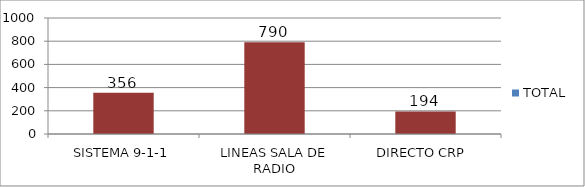
| Category | TOTAL |
|---|---|
| SISTEMA 9-1-1 | 356 |
| LINEAS SALA DE RADIO | 790 |
| DIRECTO CRP  | 194 |